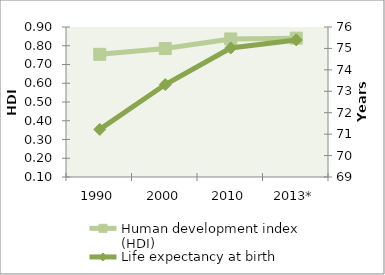
| Category | Human development index (HDI) |
|---|---|
| 1990 | 0.754 |
| 2000 | 0.785 |
| 2010 | 0.836 |
| 2013* | 0.84 |